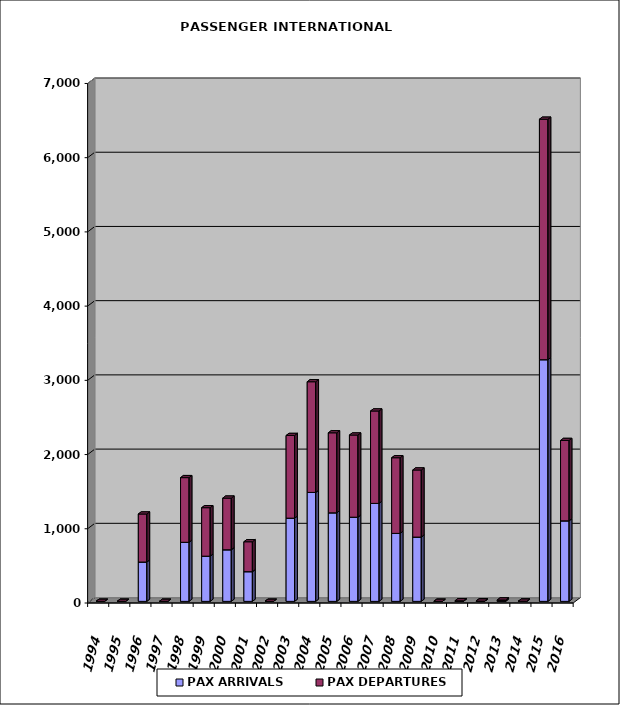
| Category | PAX ARRIVALS | PAX DEPARTURES |
|---|---|---|
| 1994.0 | 0 | 0 |
| 1995.0 | 0 | 0 |
| 1996.0 | 530 | 647 |
| 1997.0 | 0 | 0 |
| 1998.0 | 796 | 871 |
| 1999.0 | 609 | 653 |
| 2000.0 | 695 | 696 |
| 2001.0 | 400 | 403 |
| 2002.0 | 0 | 0 |
| 2003.0 | 1121 | 1114 |
| 2004.0 | 1468 | 1491 |
| 2005.0 | 1193 | 1078 |
| 2006.0 | 1134 | 1107 |
| 2007.0 | 1320 | 1245 |
| 2008.0 | 916 | 1019 |
| 2009.0 | 866 | 904 |
| 2010.0 | 0 | 0 |
| 2011.0 | 4 | 4 |
| 2012.0 | 2 | 2 |
| 2013.0 | 9 | 10 |
| 2014.0 | 0 | 2 |
| 2015.0 | 3256 | 3240 |
| 2016.0 | 1085 | 1083 |